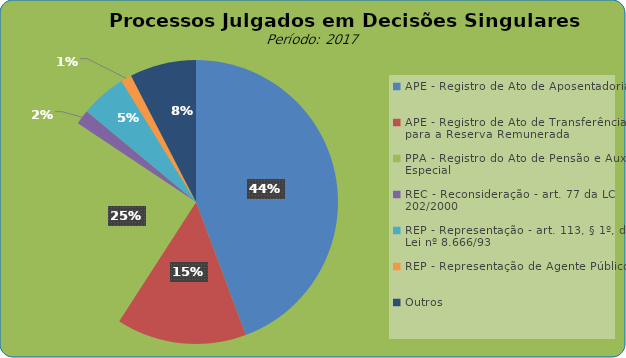
| Category | Series 0 |
|---|---|
| APE - Registro de Ato de Aposentadoria  | 1271 |
| APE - Registro de Ato de Transferência para a Reserva Remunerada  | 425 |
| PPA - Registro do Ato de Pensão e Auxílio Especial | 724 |
| REC - Reconsideração - art. 77 da LC 202/2000 | 48 |
| REP - Representação - art. 113, § 1º, da Lei nº 8.666/93 | 149 |
| REP - Representação de Agente Público  | 35 |
| Outros | 217 |